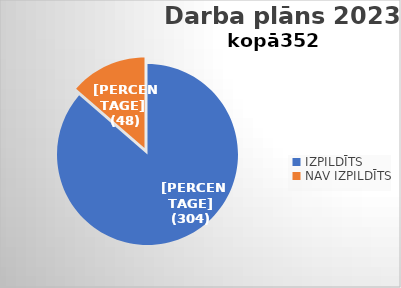
| Category | Series 0 | Series 1 |
|---|---|---|
| IZPILDĪTS | 304 | 0.864 |
| NAV IZPILDĪTS | 48 | 0.136 |